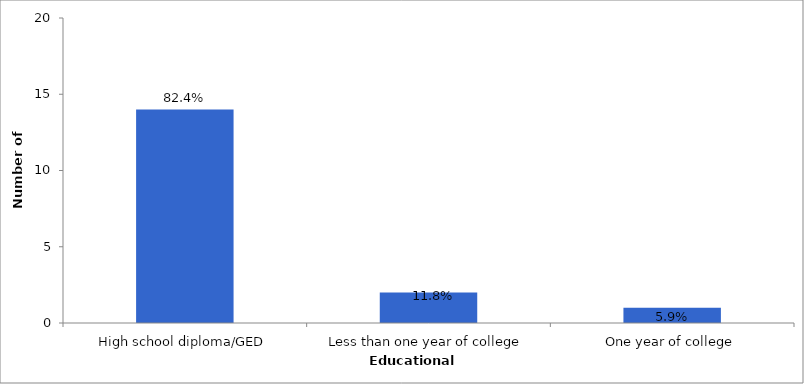
| Category | Series 0 |
|---|---|
| High school diploma/GED | 14 |
| Less than one year of college | 2 |
| One year of college | 1 |